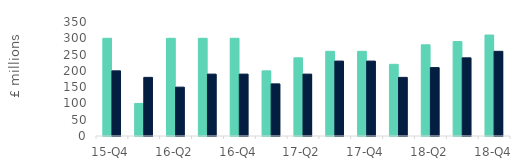
| Category | First-time
buyers | Homemovers |
|---|---|---|
| 15-Q4 | 300 | 200 |
| 16-Q1 | 100 | 180 |
| 16-Q2 | 300 | 150 |
| 16-Q3 | 300 | 190 |
| 16-Q4 | 300 | 190 |
| 17-Q1 | 200 | 160 |
| 17-Q2 | 240 | 190 |
| 17-Q3 | 260 | 230 |
| 17-Q4 | 260 | 230 |
| 18-Q1 | 220 | 180 |
| 18-Q2 | 280 | 210 |
| 18-Q3 | 290 | 240 |
| 18-Q4 | 310 | 260 |